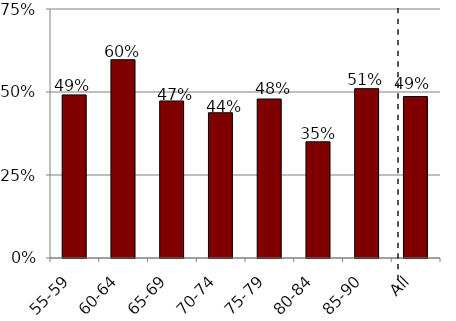
| Category | Series 0 |
|---|---|
| 55-59 | 0.491 |
| 60-64 | 0.597 |
| 65-69 | 0.473 |
| 70-74 | 0.438 |
| 75-79 | 0.479 |
| 80-84 | 0.35 |
| 85-90 | 0.51 |
| All | 0.486 |